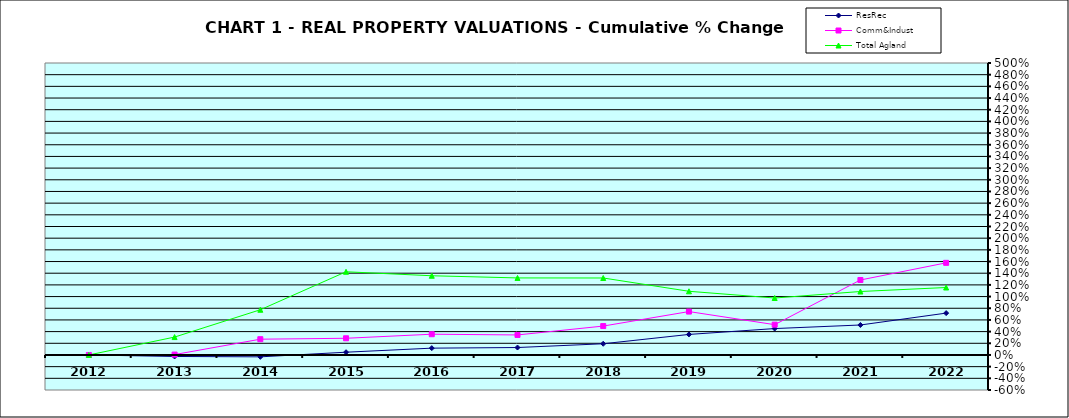
| Category | ResRec | Comm&Indust | Total Agland |
|---|---|---|---|
| 2012.0 | 0 | 0 | 0 |
| 2013.0 | -0.026 | 0.007 | 0.307 |
| 2014.0 | -0.032 | 0.27 | 0.774 |
| 2015.0 | 0.047 | 0.286 | 1.425 |
| 2016.0 | 0.117 | 0.355 | 1.356 |
| 2017.0 | 0.128 | 0.343 | 1.319 |
| 2018.0 | 0.192 | 0.495 | 1.318 |
| 2019.0 | 0.352 | 0.743 | 1.09 |
| 2020.0 | 0.452 | 0.519 | 0.975 |
| 2021.0 | 0.513 | 1.284 | 1.087 |
| 2022.0 | 0.717 | 1.578 | 1.155 |